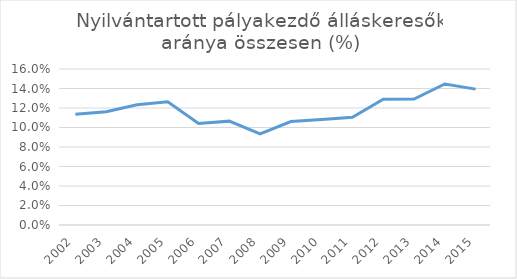
| Category | Nyilvántartott pályakezdő álláskeresők aránya összesen (%) |
|---|---|
| 2002.0 | 0.114 |
| 2003.0 | 0.116 |
| 2004.0 | 0.123 |
| 2005.0 | 0.126 |
| 2006.0 | 0.104 |
| 2007.0 | 0.107 |
| 2008.0 | 0.093 |
| 2009.0 | 0.106 |
| 2010.0 | 0.108 |
| 2011.0 | 0.111 |
| 2012.0 | 0.129 |
| 2013.0 | 0.129 |
| 2014.0 | 0.145 |
| 2015.0 | 0.139 |